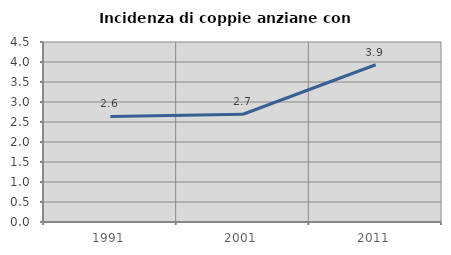
| Category | Incidenza di coppie anziane con figli |
|---|---|
| 1991.0 | 2.64 |
| 2001.0 | 2.694 |
| 2011.0 | 3.931 |